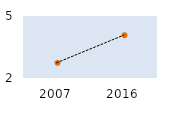
| Category | Max | OECD mean | Min |
|---|---|---|---|
| 2007.0 | 7.711 | 2.733 | 0.416 |
| 2016.0 | 11.742 | 4.069 | 0.935 |